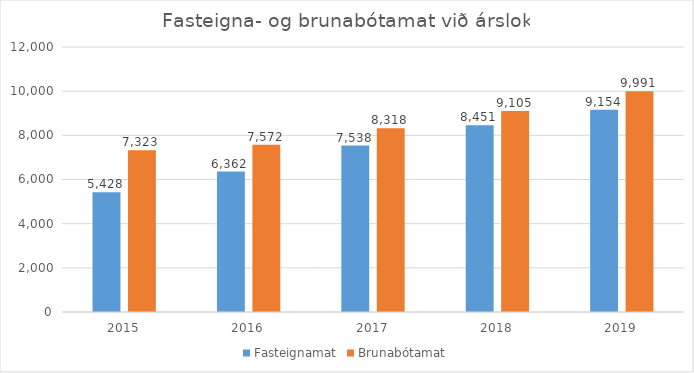
| Category | Fasteignamat | Brunabótamat |
|---|---|---|
| 2015.0 | 5428 | 7323 |
| 2016.0 | 6362 | 7572 |
| 2017.0 | 7538 | 8318 |
| 2018.0 | 8451 | 9105 |
| 2019.0 | 9154 | 9991 |